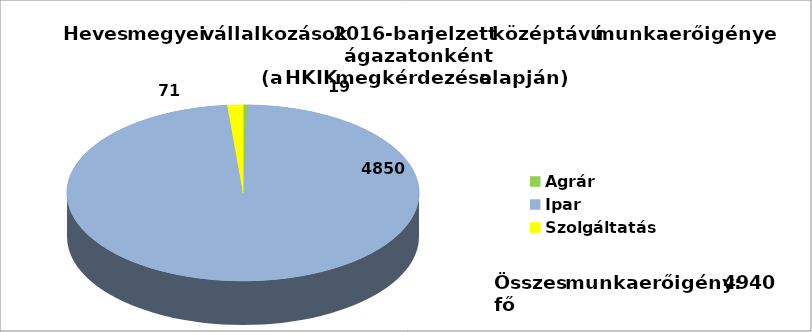
| Category | Series 0 |
|---|---|
| Agrár | 19 |
| Ipar | 4850 |
| Szolgáltatás | 71 |